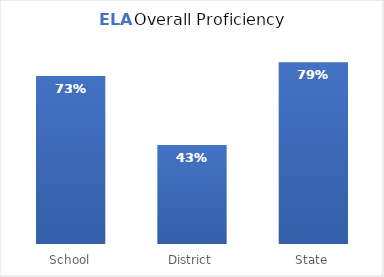
| Category | ELA |
|---|---|
| School | 0.73 |
| District | 0.43 |
| State | 0.79 |